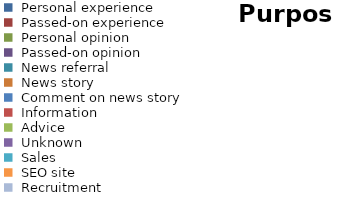
| Category | Posts | Visitors |
|---|---|---|
| Personal experience | 0 | 0 |
| Passed-on experience | 0 | 0 |
| Personal opinion | 0 | 0 |
| Passed-on opinion | 0 | 0 |
| News referral | 0 | 0 |
| News story | 0 | 0 |
| Comment on news story | 0 | 0 |
| Information | 0 | 0 |
| Advice | 0 | 0 |
| Unknown | 0 | 0 |
| Sales | 0 | 0 |
| SEO site | 0 | 0 |
| Recruitment | 0 | 0 |